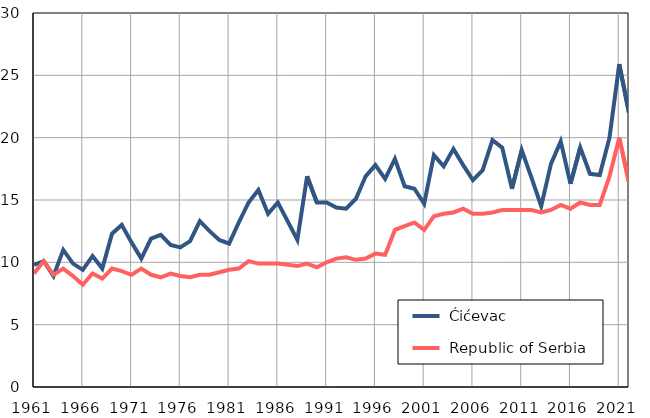
| Category |  Ćićevac |  Republic of Serbia |
|---|---|---|
| 1961.0 | 9.8 | 9.1 |
| 1962.0 | 10.1 | 10.1 |
| 1963.0 | 8.9 | 9 |
| 1964.0 | 11 | 9.5 |
| 1965.0 | 9.9 | 8.9 |
| 1966.0 | 9.4 | 8.2 |
| 1967.0 | 10.5 | 9.1 |
| 1968.0 | 9.5 | 8.7 |
| 1969.0 | 12.3 | 9.5 |
| 1970.0 | 13 | 9.3 |
| 1971.0 | 11.6 | 9 |
| 1972.0 | 10.3 | 9.5 |
| 1973.0 | 11.9 | 9 |
| 1974.0 | 12.2 | 8.8 |
| 1975.0 | 11.4 | 9.1 |
| 1976.0 | 11.2 | 8.9 |
| 1977.0 | 11.7 | 8.8 |
| 1978.0 | 13.3 | 9 |
| 1979.0 | 12.5 | 9 |
| 1980.0 | 11.8 | 9.2 |
| 1981.0 | 11.5 | 9.4 |
| 1982.0 | 13.2 | 9.5 |
| 1983.0 | 14.8 | 10.1 |
| 1984.0 | 15.8 | 9.9 |
| 1985.0 | 13.9 | 9.9 |
| 1986.0 | 14.8 | 9.9 |
| 1987.0 | 13.3 | 9.8 |
| 1988.0 | 11.8 | 9.7 |
| 1989.0 | 16.9 | 9.9 |
| 1990.0 | 14.8 | 9.6 |
| 1991.0 | 14.8 | 10 |
| 1992.0 | 14.4 | 10.3 |
| 1993.0 | 14.3 | 10.4 |
| 1994.0 | 15.1 | 10.2 |
| 1995.0 | 16.9 | 10.3 |
| 1996.0 | 17.8 | 10.7 |
| 1997.0 | 16.7 | 10.6 |
| 1998.0 | 18.3 | 12.6 |
| 1999.0 | 16.1 | 12.9 |
| 2000.0 | 15.9 | 13.2 |
| 2001.0 | 14.7 | 12.6 |
| 2002.0 | 18.6 | 13.7 |
| 2003.0 | 17.7 | 13.9 |
| 2004.0 | 19.1 | 14 |
| 2005.0 | 17.8 | 14.3 |
| 2006.0 | 16.6 | 13.9 |
| 2007.0 | 17.4 | 13.9 |
| 2008.0 | 19.8 | 14 |
| 2009.0 | 19.2 | 14.2 |
| 2010.0 | 15.9 | 14.2 |
| 2011.0 | 19 | 14.2 |
| 2012.0 | 16.8 | 14.2 |
| 2013.0 | 14.5 | 14 |
| 2014.0 | 17.9 | 14.2 |
| 2015.0 | 19.7 | 14.6 |
| 2016.0 | 16.3 | 14.3 |
| 2017.0 | 19.2 | 14.8 |
| 2018.0 | 17.1 | 14.6 |
| 2019.0 | 17 | 14.6 |
| 2020.0 | 20 | 16.9 |
| 2021.0 | 25.9 | 20 |
| 2022.0 | 22 | 16.4 |